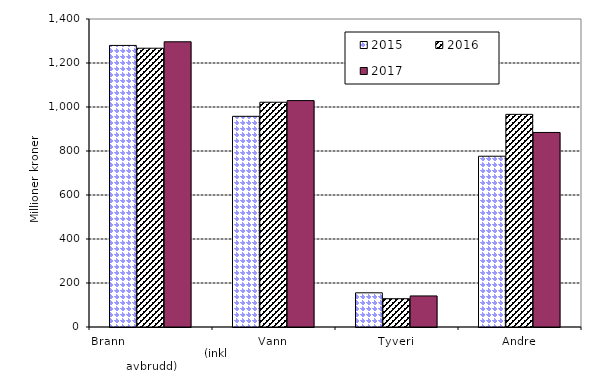
| Category | 2015 | 2016 | 2017 |
|---|---|---|---|
| Brann                                                       (inkl avbrudd) | 1279.836 | 1267.177 | 1296.447 |
| Vann | 957.605 | 1021.63 | 1029.148 |
| Tyveri | 155.37 | 128.593 | 141.15 |
| Andre | 776.252 | 966.541 | 884.24 |